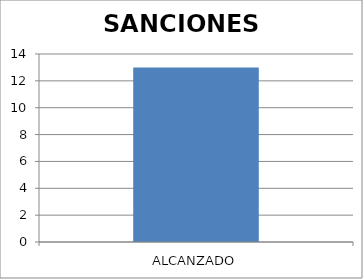
| Category | SANCIONES IMPUESTAS |
|---|---|
| ALCANZADO | 13 |